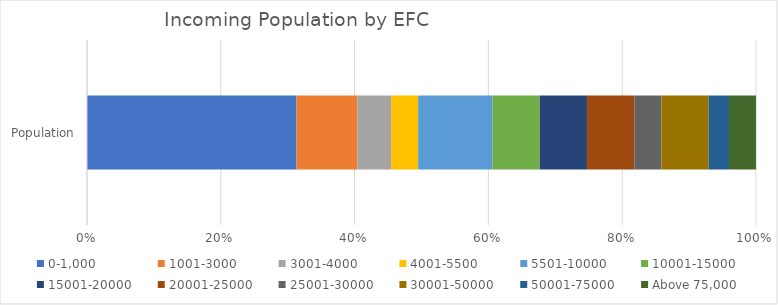
| Category | 0-1,000 | 1001-3000 | 3001-4000 | 4001-5500 | 5501-10000 | 10001-15000 | 15001-20000 | 20001-25000 | 25001-30000 | 30001-50000 | 50001-75000 | Above 75,000 |
|---|---|---|---|---|---|---|---|---|---|---|---|---|
| Population | 0.31 | 0.09 | 0.05 | 0.04 | 0.11 | 0.07 | 0.07 | 0.07 | 0.04 | 0.07 | 0.03 | 0.04 |